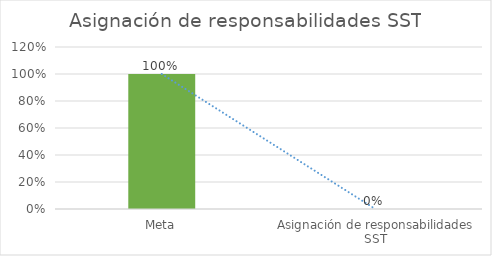
| Category | Series 0 |
|---|---|
| Meta | 1 |
| Asignación de responsabilidades SST | 0 |